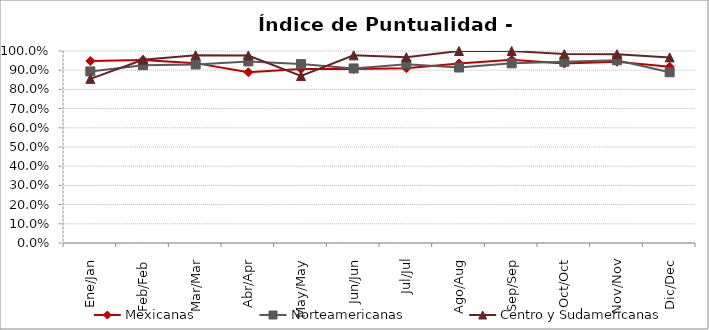
| Category | Mexicanas | Norteamericanas | Centro y Sudamericanas |
|---|---|---|---|
| Ene/Jan | 0.948 | 0.894 | 0.855 |
| Feb/Feb | 0.953 | 0.926 | 0.955 |
| Mar/Mar | 0.937 | 0.93 | 0.978 |
| Abr/Apr | 0.889 | 0.946 | 0.977 |
| May/May | 0.906 | 0.932 | 0.87 |
| Jun/Jun | 0.906 | 0.909 | 0.977 |
| Jul/Jul | 0.911 | 0.93 | 0.968 |
| Ago/Aug | 0.935 | 0.914 | 1 |
| Sep/Sep | 0.955 | 0.936 | 1 |
| Oct/Oct | 0.935 | 0.944 | 0.984 |
| Nov/Nov | 0.944 | 0.952 | 0.983 |
| Dic/Dec | 0.918 | 0.889 | 0.967 |